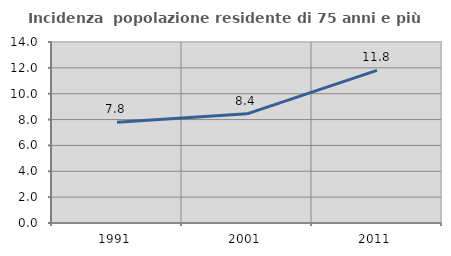
| Category | Incidenza  popolazione residente di 75 anni e più |
|---|---|
| 1991.0 | 7.8 |
| 2001.0 | 8.445 |
| 2011.0 | 11.808 |